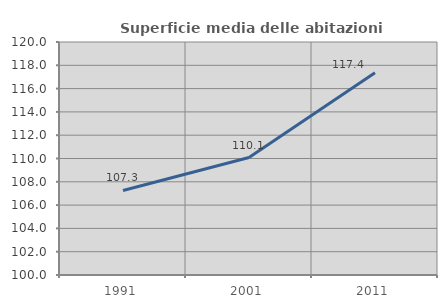
| Category | Superficie media delle abitazioni occupate |
|---|---|
| 1991.0 | 107.256 |
| 2001.0 | 110.08 |
| 2011.0 | 117.358 |